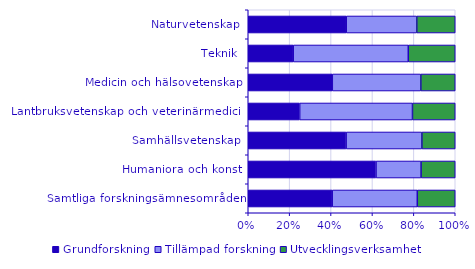
| Category | Grundforskning | Tillämpad forskning | Utvecklingsverksamhet |
|---|---|---|---|
| Naturvetenskap | 5346436 | 3847645 | 2100679 |
| Teknik | 1568344 | 4012555 | 1638362 |
| Medicin och hälsovetenskap | 5194622 | 5469135 | 2128649 |
| Lantbruksvetenskap och veterinärmedicin | 665566 | 1459905 | 553488 |
| Samhällsvetenskap | 2929332 | 2266690 | 998830 |
| Humaniora och konst | 1728355 | 609344 | 462352 |
| Samtliga forskningsämnesområden | 17432655.779 | 17665273.478 | 7882360.262 |